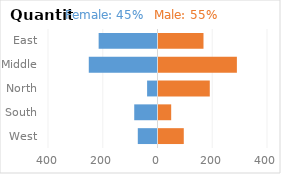
| Category | Female | Male |
|---|---|---|
| East | -215 | 168 |
| Middle | -251 | 290 |
| North | -38 | 191 |
| South | -85 | 50 |
| West | -72 | 96 |